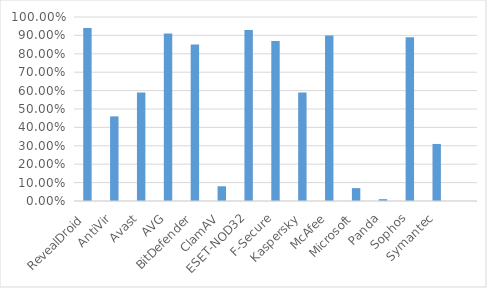
| Category | Series 0 |
|---|---|
| RevealDroid | 0.94 |
| AntiVir | 0.46 |
| Avast | 0.59 |
| AVG | 0.91 |
| BitDefender | 0.85 |
| ClamAV | 0.08 |
| ESET-NOD32 | 0.93 |
| F-Secure | 0.87 |
| Kaspersky | 0.59 |
| McAfee | 0.9 |
| Microsoft | 0.07 |
| Panda | 0.01 |
| Sophos | 0.89 |
| Symantec | 0.31 |